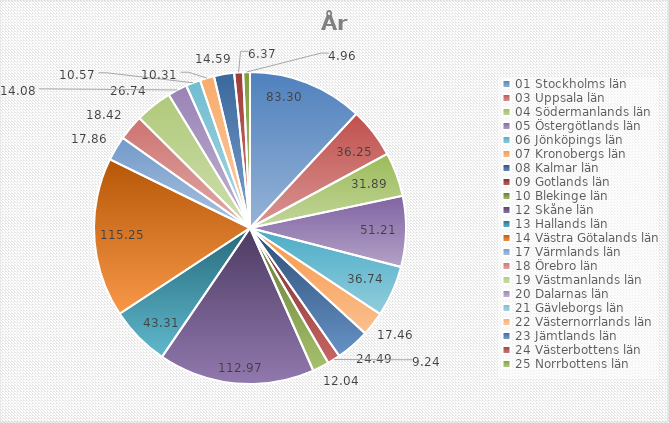
| Category | Series 0 |
|---|---|
| 01 Stockholms län | 83.3 |
| 03 Uppsala län | 36.25 |
| 04 Södermanlands län | 31.89 |
| 05 Östergötlands län | 51.21 |
| 06 Jönköpings län | 36.74 |
| 07 Kronobergs län | 17.46 |
| 08 Kalmar län | 24.49 |
| 09 Gotlands län | 9.24 |
| 10 Blekinge län | 12.04 |
| 12 Skåne län | 112.97 |
| 13 Hallands län | 43.31 |
| 14 Västra Götalands län | 115.25 |
| 17 Värmlands län | 17.86 |
| 18 Örebro län | 18.42 |
| 19 Västmanlands län | 26.74 |
| 20 Dalarnas län | 14.08 |
| 21 Gävleborgs län | 10.57 |
| 22 Västernorrlands län | 10.31 |
| 23 Jämtlands län | 14.59 |
| 24 Västerbottens län | 6.37 |
| 25 Norrbottens län | 4.96 |